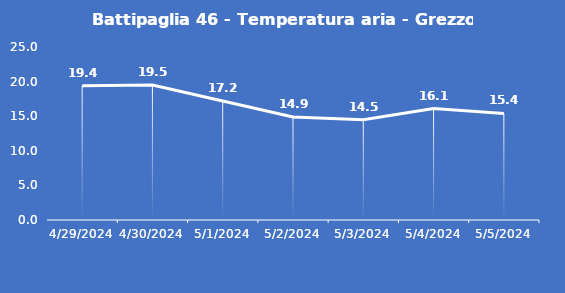
| Category | Battipaglia 46 - Temperatura aria - Grezzo (°C) |
|---|---|
| 4/29/24 | 19.4 |
| 4/30/24 | 19.5 |
| 5/1/24 | 17.2 |
| 5/2/24 | 14.9 |
| 5/3/24 | 14.5 |
| 5/4/24 | 16.1 |
| 5/5/24 | 15.4 |